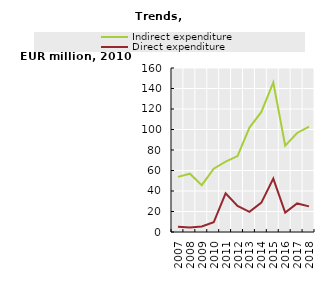
| Category | Indirect expenditure | Direct expenditure |
|---|---|---|
| 2007.0 | 53750378.176 | 5013318.353 |
| 2008.0 | 56872616.456 | 4502051.223 |
| 2009.0 | 45677096.921 | 5321281.805 |
| 2010.0 | 61800628.497 | 9461452.826 |
| 2011.0 | 68573298.727 | 37665089.162 |
| 2012.0 | 74106583.053 | 25444174.555 |
| 2013.0 | 101932511.003 | 19724096.016 |
| 2014.0 | 117102326.674 | 28622438.315 |
| 2015.0 | 145890990.083 | 52119543.921 |
| 2016.0 | 84301982.153 | 18864373.836 |
| 2017.0 | 96622338.054 | 27846363.264 |
| 2018.0 | 102697850.408 | 25004319.365 |